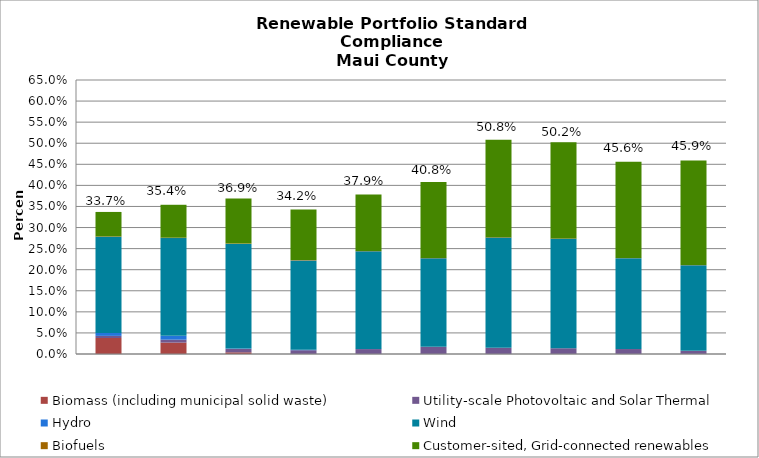
| Category | Biomass (including municipal solid waste) | Utility-scale Photovoltaic and Solar Thermal | Hydro | Wind | Biofuels | Customer-sited, Grid-connected renewables |
|---|---|---|---|---|---|---|
| 2014.0 | 0.038 | 0.005 | 0.007 | 0.228 | 0.001 | 0.058 |
| 2015.0 | 0.027 | 0.007 | 0.009 | 0.232 | 0.001 | 0.078 |
| 2016.0 | 0.004 | 0.008 | 0.001 | 0.248 | 0.001 | 0.107 |
| 2017.0 | 0 | 0.009 | 0.001 | 0.212 | 0.001 | 0.12 |
| 2018.0 | 0 | 0.012 | 0 | 0.232 | 0.001 | 0.134 |
| 2019.0 | 0 | 0.017 | 0 | 0.21 | 0.001 | 0.18 |
| 2020.0 | 0 | 0.015 | 0 | 0.262 | 0.001 | 0.231 |
| 2021.0 | 0 | 0.014 | 0 | 0.26 | 0.001 | 0.228 |
| 2022.0 | 0 | 0.012 | 0 | 0.216 | 0.001 | 0.228 |
| 2023.0 | 0 | 0.008 | 0 | 0.203 | 0 | 0.248 |